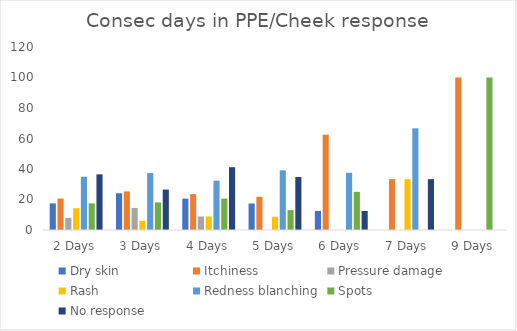
| Category | Dry skin | Itchiness | Pressure damage | Rash | Redness blanching | Spots | No response |
|---|---|---|---|---|---|---|---|
| 2 Days | 17.46 | 20.635 | 7.937 | 14.286 | 34.921 | 17.46 | 36.508 |
| 3 Days | 24.096 | 25.301 | 14.458 | 6.024 | 37.349 | 18.072 | 26.506 |
| 4 Days | 20.588 | 23.529 | 8.824 | 8.824 | 32.353 | 20.588 | 41.176 |
| 5 Days | 17.391 | 21.739 | 0 | 8.696 | 39.13 | 13.043 | 34.783 |
| 6 Days | 12.5 | 62.5 | 0 | 0 | 37.5 | 25 | 12.5 |
| 7 Days | 0 | 33.333 | 0 | 33.333 | 66.667 | 0 | 33.333 |
| 9 Days | 0 | 100 | 0 | 0 | 0 | 100 | 0 |